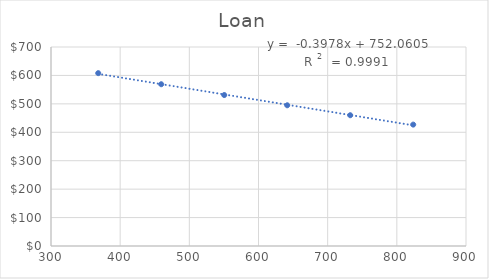
| Category | Loan |
|---|---|
| 823.679800577148 | 427 |
| 732.5997095436466 | 460 |
| 641.5196185101452 | 495 |
| 550.4395274766439 | 531 |
| 459.35943644314256 | 569 |
| 368.2793454096412 | 608 |